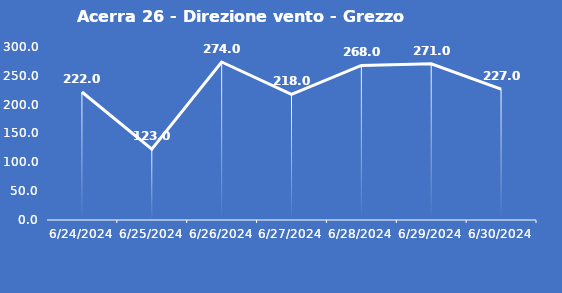
| Category | Acerra 26 - Direzione vento - Grezzo (°N) |
|---|---|
| 6/24/24 | 222 |
| 6/25/24 | 123 |
| 6/26/24 | 274 |
| 6/27/24 | 218 |
| 6/28/24 | 268 |
| 6/29/24 | 271 |
| 6/30/24 | 227 |